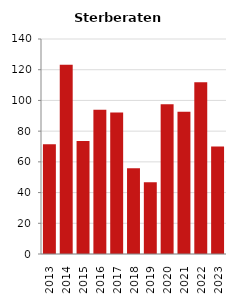
| Category | Sterberate der Bevölkerung ab 80 Jahre (auf Tsd.) |
|---|---|
| 2013.0 | 71.429 |
| 2014.0 | 123.188 |
| 2015.0 | 73.529 |
| 2016.0 | 93.96 |
| 2017.0 | 92.105 |
| 2018.0 | 55.901 |
| 2019.0 | 46.784 |
| 2020.0 | 97.561 |
| 2021.0 | 92.593 |
| 2022.0 | 111.842 |
| 2023.0 | 70.064 |